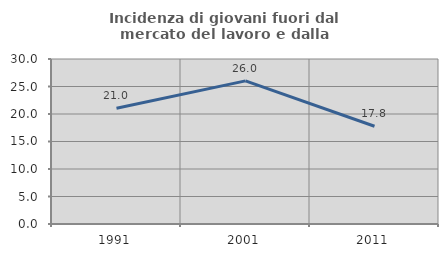
| Category | Incidenza di giovani fuori dal mercato del lavoro e dalla formazione  |
|---|---|
| 1991.0 | 21.032 |
| 2001.0 | 26.027 |
| 2011.0 | 17.778 |